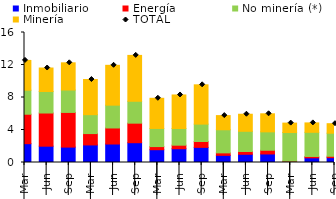
| Category | Inmobiliario | Energía | No minería (*) | Minería |
|---|---|---|---|---|
| 0 | 2.317 | 3.624 | 2.957 | 3.665 |
| 1 | 2.008 | 4.082 | 2.648 | 2.89 |
| 2 | 1.896 | 4.267 | 2.758 | 3.347 |
| 3 | 2.161 | 1.399 | 2.328 | 4.324 |
| 4 | 2.275 | 1.974 | 2.809 | 4.903 |
| 5 | 2.436 | 2.406 | 2.695 | 5.645 |
| 6 | 1.574 | 0.386 | 2.231 | 3.712 |
| 7 | 1.693 | 0.437 | 2.049 | 4.131 |
| 8 | 1.863 | 0.72 | 2.141 | 4.836 |
| 9 | 0.881 | 0.305 | 2.844 | 1.742 |
| 10 | 1.013 | 0.339 | 2.488 | 2.099 |
| 11 | 1.05 | 0.461 | 2.262 | 2.222 |
| 12 | 0 | 0.165 | 3.524 | 1.157 |
| 13 | 0.577 | 0.165 | 2.975 | 1.156 |
| 14 | 0.593 | 0.174 | 2.837 | 1.172 |